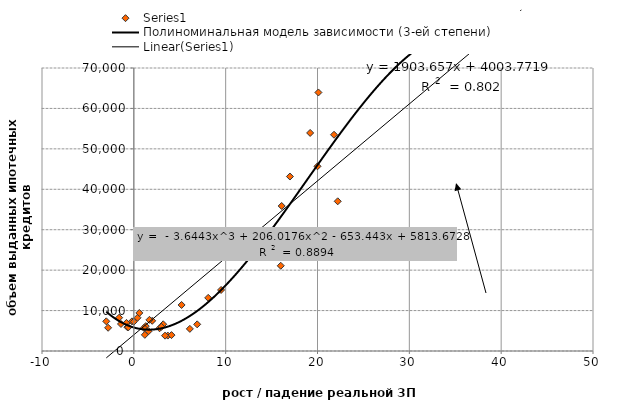
| Category | Series 0 |
|---|---|
| 16.599999999999994 | 23682 |
| 16.099999999999994 | 35872 |
| 22.200000000000003 | 37029 |
| 20.0 | 45689 |
| 20.099999999999994 | 63945 |
| 19.200000000000003 | 53934 |
| 21.799999999999997 | 53487 |
| 17.0 | 43158 |
| 16.0 | 21081 |
| 9.5 | 15097 |
| 8.099999999999994 | 13146 |
| 5.200000000000003 | 11385 |
| 0.4000000000000057 | 8221 |
| 0.5999999999999943 | 9411 |
| -3.0 | 7339 |
| -1.5999999999999943 | 8242 |
| -0.7999999999999972 | 6947 |
| 1.2999999999999972 | 6155 |
| -1.4000000000000057 | 6684 |
| -2.799999999999997 | 5744 |
| -0.20000000000000284 | 7329 |
| 0.0 | 7249 |
| -0.7000000000000028 | 5893 |
| -0.5999999999999943 | 5858 |
| 3.700000000000003 | 3814 |
| 4.099999999999994 | 3931 |
| 3.4000000000000057 | 3792 |
| 2.799999999999997 | 5627 |
| 1.0999999999999943 | 5715 |
| 1.5999999999999943 | 4888 |
| 3.200000000000003 | 6608 |
| 2.0 | 7468 |
| 1.7000000000000028 | 7709 |
| 3.0 | 5984 |
| 6.099999999999994 | 5475 |
| 6.900000000000006 | 6593 |
| 1.2000000000000028 | 3997 |